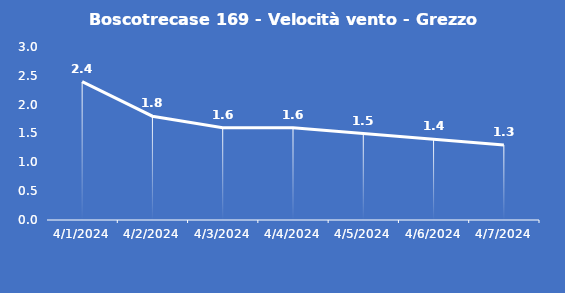
| Category | Boscotrecase 169 - Velocità vento - Grezzo (m/s) |
|---|---|
| 4/1/24 | 2.4 |
| 4/2/24 | 1.8 |
| 4/3/24 | 1.6 |
| 4/4/24 | 1.6 |
| 4/5/24 | 1.5 |
| 4/6/24 | 1.4 |
| 4/7/24 | 1.3 |